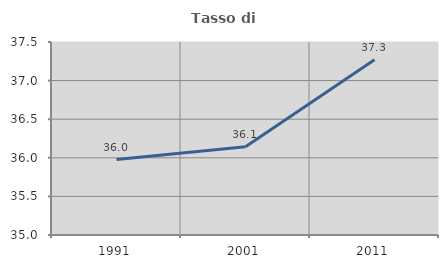
| Category | Tasso di occupazione   |
|---|---|
| 1991.0 | 35.977 |
| 2001.0 | 36.142 |
| 2011.0 | 37.271 |